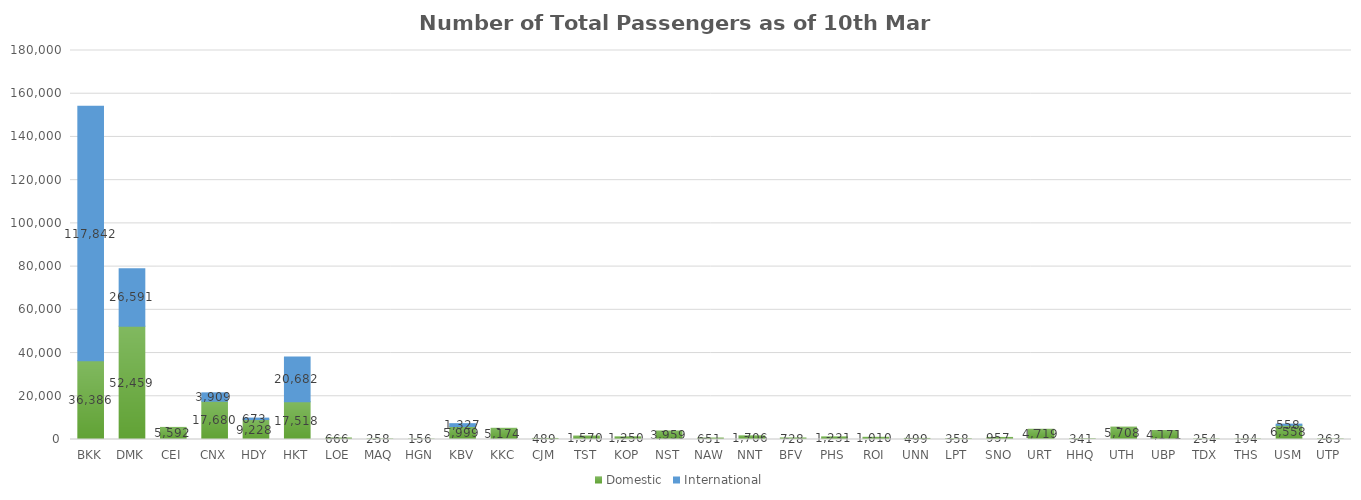
| Category | Domestic | International |
|---|---|---|
| BKK | 36386 | 117842 |
| DMK | 52459 | 26591 |
| CEI | 5592 | 0 |
| CNX | 17680 | 3909 |
| HDY | 9228 | 673 |
| HKT | 17518 | 20682 |
| LOE | 666 | 0 |
| MAQ | 258 | 0 |
| HGN | 156 | 0 |
| KBV | 5999 | 1327 |
| KKC | 5174 | 0 |
| CJM | 489 | 0 |
| TST | 1570 | 0 |
| KOP | 1250 | 0 |
| NST | 3959 | 0 |
| NAW | 651 | 0 |
| NNT | 1706 | 0 |
| BFV | 728 | 0 |
| PHS | 1231 | 0 |
| ROI | 1010 | 0 |
| UNN | 499 | 0 |
| LPT | 358 | 0 |
| SNO | 957 | 0 |
| URT | 4719 | 0 |
| HHQ | 341 | 0 |
| UTH | 5708 | 0 |
| UBP | 4171 | 0 |
| TDX | 254 | 0 |
| THS | 194 | 0 |
| USM | 6558 | 558 |
| UTP | 263 | 0 |